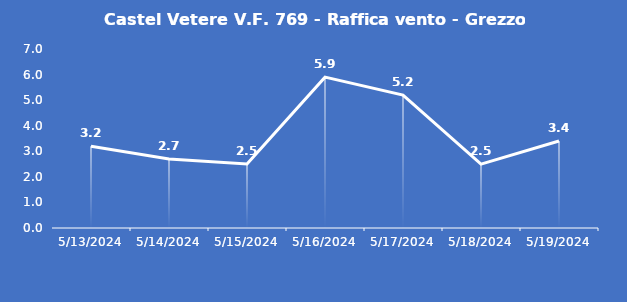
| Category | Castel Vetere V.F. 769 - Raffica vento - Grezzo (m/s) |
|---|---|
| 5/13/24 | 3.2 |
| 5/14/24 | 2.7 |
| 5/15/24 | 2.5 |
| 5/16/24 | 5.9 |
| 5/17/24 | 5.2 |
| 5/18/24 | 2.5 |
| 5/19/24 | 3.4 |